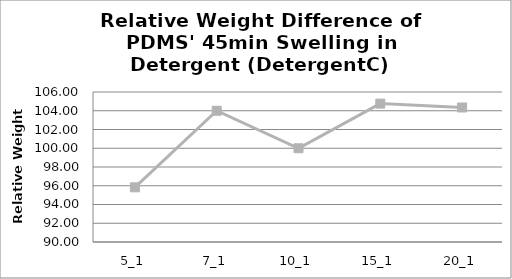
| Category | Relative weight (%) |
|---|---|
| 5_1 | 95.833 |
| 7_1 | 104 |
| 10_1 | 100 |
| 15_1 | 104.762 |
| 20_1 | 104.348 |